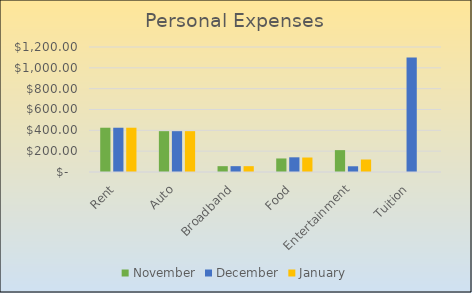
| Category | November | December | January |
|---|---|---|---|
| Rent | 425 | 425 | 425 |
| Auto | 392 | 392 | 392 |
| Broadband | 56 | 56 | 56 |
| Food | 130 | 141 | 139 |
| Entertainment | 210 | 55 | 120 |
| Tuition | 0 | 1100 | 0 |